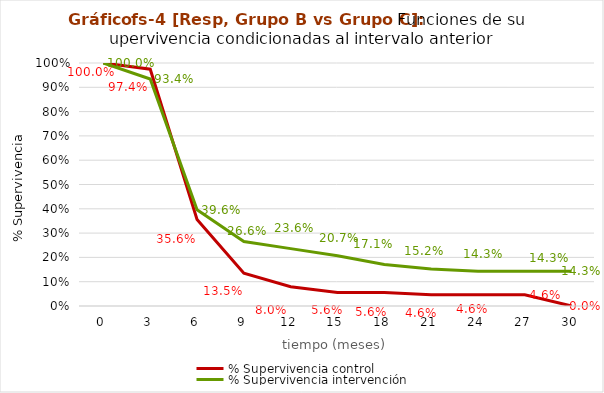
| Category | % Supervivencia control | % Supervivencia intervención |
|---|---|---|
| 0.0 | 1 | 1 |
| 3.0 | 0.974 | 0.934 |
| 6.0 | 0.356 | 0.396 |
| 9.0 | 0.135 | 0.266 |
| 12.0 | 0.08 | 0.236 |
| 15.0 | 0.056 | 0.207 |
| 18.0 | 0.056 | 0.171 |
| 21.0 | 0.046 | 0.152 |
| 24.0 | 0.046 | 0.143 |
| 27.0 | 0.046 | 0.143 |
| 30.0 | 0 | 0.143 |